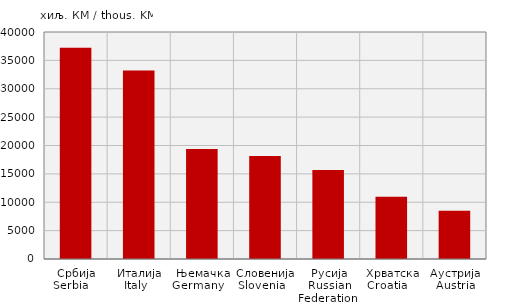
| Category | Увоз
Import |
|---|---|
| Србија
Serbia    | 37238 |
| Италија
Italy   | 33202 |
| Њемачка
Germany    | 19378 |
| Словенија
Slovenia   | 18147 |
| Русија
Russian Federation  | 15689 |
| Хрватска
Croatia    | 10965 |
| Аустрија
Austria | 8524 |